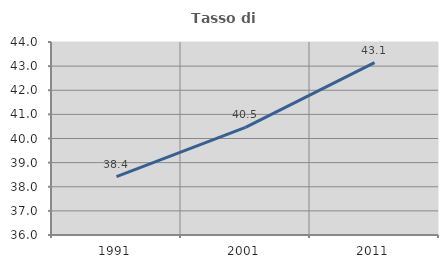
| Category | Tasso di occupazione   |
|---|---|
| 1991.0 | 38.42 |
| 2001.0 | 40.461 |
| 2011.0 | 43.142 |